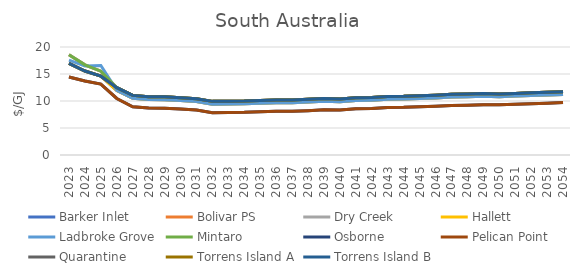
| Category | Barker Inlet | Bolivar PS | Dry Creek | Hallett | Ladbroke Grove | Mintaro | Osborne | Pelican Point | Quarantine | Torrens Island A | Torrens Island B |
|---|---|---|---|---|---|---|---|---|---|---|---|
| 2023.0 | 16.966 | 18.547 | 18.547 | 16.966 | 17.568 | 18.547 | 14.436 | 14.436 | 16.966 | 16.966 | 16.966 |
| 2024.0 | 15.548 | 16.698 | 16.698 | 15.548 | 16.485 | 16.698 | 13.709 | 13.709 | 15.548 | 15.548 | 15.548 |
| 2025.0 | 14.6 | 15.517 | 15.517 | 14.6 | 16.57 | 15.517 | 13.132 | 13.132 | 14.6 | 14.6 | 14.6 |
| 2026.0 | 11.967 | 12.467 | 12.467 | 11.967 | 11.967 | 12.467 | 10.467 | 10.467 | 12.467 | 12.467 | 12.467 |
| 2027.0 | 10.516 | 11.041 | 11.041 | 10.516 | 10.516 | 11.041 | 8.941 | 8.941 | 11.041 | 11.041 | 11.041 |
| 2028.0 | 10.282 | 10.807 | 10.807 | 10.282 | 10.282 | 10.807 | 8.707 | 8.707 | 10.807 | 10.807 | 10.807 |
| 2029.0 | 10.242 | 10.767 | 10.767 | 10.242 | 10.242 | 10.767 | 8.667 | 8.667 | 10.767 | 10.767 | 10.767 |
| 2030.0 | 10.075 | 10.6 | 10.6 | 10.075 | 10.075 | 10.6 | 8.5 | 8.5 | 10.6 | 10.6 | 10.6 |
| 2031.0 | 9.899 | 10.424 | 10.424 | 9.899 | 9.899 | 10.424 | 8.324 | 8.324 | 10.424 | 10.424 | 10.424 |
| 2032.0 | 9.408 | 9.933 | 9.933 | 9.408 | 9.408 | 9.933 | 7.833 | 7.833 | 9.933 | 9.933 | 9.933 |
| 2033.0 | 9.432 | 9.957 | 9.957 | 9.432 | 9.432 | 9.957 | 7.857 | 7.857 | 9.957 | 9.957 | 9.957 |
| 2034.0 | 9.47 | 9.995 | 9.995 | 9.47 | 9.47 | 9.995 | 7.895 | 7.895 | 9.995 | 9.995 | 9.995 |
| 2035.0 | 9.583 | 10.108 | 10.108 | 9.583 | 9.583 | 10.108 | 8.008 | 8.008 | 10.108 | 10.108 | 10.108 |
| 2036.0 | 9.658 | 10.183 | 10.183 | 9.658 | 9.658 | 10.183 | 8.083 | 8.083 | 10.183 | 10.183 | 10.183 |
| 2037.0 | 9.679 | 10.204 | 10.204 | 9.679 | 9.679 | 10.204 | 8.104 | 8.104 | 10.204 | 10.204 | 10.204 |
| 2038.0 | 9.792 | 10.317 | 10.317 | 9.792 | 9.792 | 10.317 | 8.217 | 8.217 | 10.317 | 10.317 | 10.317 |
| 2039.0 | 9.941 | 10.466 | 10.466 | 9.941 | 9.941 | 10.466 | 8.366 | 8.366 | 10.466 | 10.466 | 10.466 |
| 2040.0 | 9.869 | 10.381 | 10.381 | 9.869 | 9.869 | 10.381 | 8.331 | 8.331 | 10.381 | 10.381 | 10.381 |
| 2041.0 | 10.085 | 10.597 | 10.597 | 10.085 | 10.085 | 10.597 | 8.547 | 8.547 | 10.597 | 10.597 | 10.597 |
| 2042.0 | 10.158 | 10.671 | 10.671 | 10.158 | 10.158 | 10.671 | 8.621 | 8.621 | 10.671 | 10.671 | 10.671 |
| 2043.0 | 10.329 | 10.841 | 10.841 | 10.329 | 10.329 | 10.841 | 8.791 | 8.791 | 10.841 | 10.841 | 10.841 |
| 2044.0 | 10.364 | 10.876 | 10.876 | 10.364 | 10.364 | 10.876 | 8.826 | 8.826 | 10.876 | 10.876 | 10.876 |
| 2045.0 | 10.48 | 10.992 | 10.992 | 10.48 | 10.48 | 10.992 | 8.942 | 8.942 | 10.992 | 10.992 | 10.992 |
| 2046.0 | 10.575 | 11.088 | 11.088 | 10.575 | 10.575 | 11.088 | 9.038 | 9.038 | 11.088 | 11.088 | 11.088 |
| 2047.0 | 10.721 | 11.234 | 11.234 | 10.721 | 10.721 | 11.234 | 9.184 | 9.184 | 11.234 | 11.234 | 11.234 |
| 2048.0 | 10.766 | 11.279 | 11.279 | 10.766 | 10.766 | 11.279 | 9.229 | 9.229 | 11.279 | 11.279 | 11.279 |
| 2049.0 | 10.862 | 11.375 | 11.375 | 10.862 | 10.862 | 11.375 | 9.325 | 9.325 | 11.375 | 11.375 | 11.375 |
| 2050.0 | 10.804 | 11.309 | 11.309 | 10.804 | 10.804 | 11.309 | 9.29 | 9.29 | 11.309 | 11.309 | 11.309 |
| 2051.0 | 10.906 | 11.411 | 11.411 | 10.906 | 10.906 | 11.411 | 9.392 | 9.392 | 11.411 | 11.411 | 11.411 |
| 2052.0 | 11.009 | 11.513 | 11.513 | 11.009 | 11.009 | 11.513 | 9.496 | 9.496 | 11.513 | 11.513 | 11.513 |
| 2053.0 | 11.113 | 11.617 | 11.617 | 11.113 | 11.113 | 11.617 | 9.601 | 9.601 | 11.617 | 11.617 | 11.617 |
| 2054.0 | 11.218 | 11.722 | 11.722 | 11.218 | 11.218 | 11.722 | 9.707 | 9.707 | 11.722 | 11.722 | 11.722 |